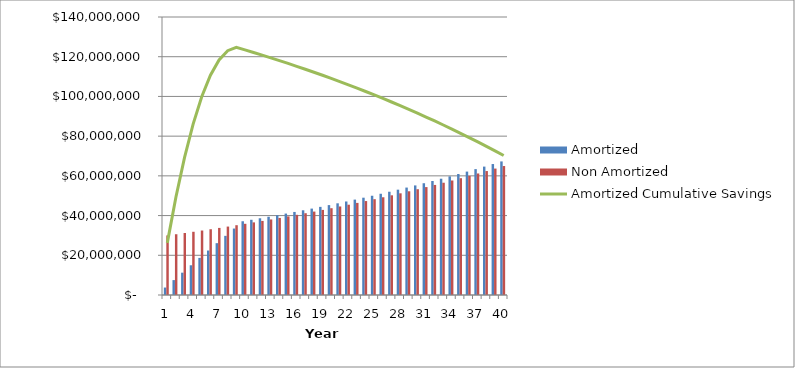
| Category | Amortized | Non Amortized |
|---|---|---|
| 0 | 3756000 | 30000000 |
| 1 | 7503120 | 30600000 |
| 2 | 11241182.4 | 31212000 |
| 3 | 14970006.048 | 31836240 |
| 4 | 18689406.169 | 32472964.8 |
| 5 | 22399194.292 | 33122424.096 |
| 6 | 26099178.178 | 33784872.578 |
| 7 | 29789161.742 | 34460570.029 |
| 8 | 33468944.977 | 35149781.43 |
| 9 | 37138323.876 | 35852777.059 |
| 10 | 37881090.354 | 36569832.6 |
| 11 | 38638712.161 | 37301229.252 |
| 12 | 39411486.404 | 38047253.837 |
| 13 | 40199716.132 | 38808198.914 |
| 14 | 41003710.455 | 39584362.892 |
| 15 | 41823784.664 | 40376050.15 |
| 16 | 42660260.357 | 41183571.153 |
| 17 | 43513465.564 | 42007242.576 |
| 18 | 44383734.875 | 42847387.427 |
| 19 | 45271409.573 | 43704335.176 |
| 20 | 46176837.764 | 44578421.879 |
| 21 | 47100374.52 | 45469990.317 |
| 22 | 48042382.01 | 46379390.123 |
| 23 | 49003229.65 | 47306977.926 |
| 24 | 49983294.243 | 48253117.484 |
| 25 | 50982960.128 | 49218179.834 |
| 26 | 52002619.331 | 50202543.431 |
| 27 | 53042671.717 | 51206594.299 |
| 28 | 54103525.152 | 52230726.185 |
| 29 | 55185595.655 | 53275340.709 |
| 30 | 56289307.568 | 54340847.523 |
| 31 | 57415093.719 | 55427664.474 |
| 32 | 58563395.594 | 56536217.763 |
| 33 | 59734663.505 | 57666942.118 |
| 34 | 60929356.776 | 58820280.961 |
| 35 | 62147943.911 | 59996686.58 |
| 36 | 63390902.789 | 61196620.311 |
| 37 | 64658720.845 | 62420552.718 |
| 38 | 65951895.262 | 63668963.772 |
| 39 | 67270933.167 | 64942343.047 |